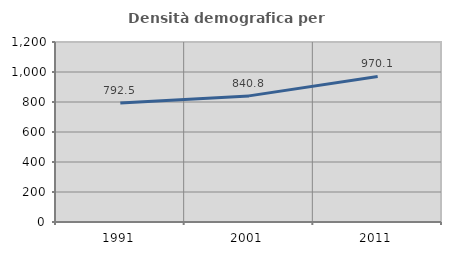
| Category | Densità demografica |
|---|---|
| 1991.0 | 792.542 |
| 2001.0 | 840.764 |
| 2011.0 | 970.128 |